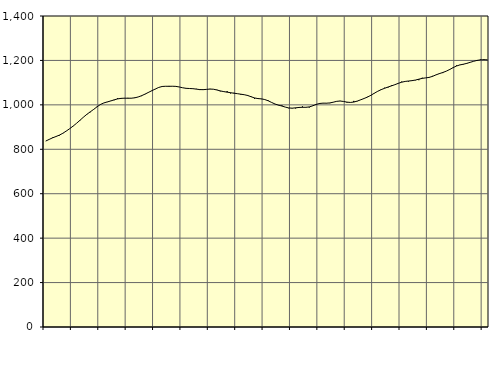
| Category | Piggar | Series 1 |
|---|---|---|
| nan | 837.2 | 837.03 |
| 87.0 | 844.1 | 844.34 |
| 87.0 | 853.3 | 851.46 |
| 87.0 | 857.9 | 857.43 |
| nan | 861.9 | 863.77 |
| 88.0 | 873.3 | 872.06 |
| 88.0 | 882.4 | 882.04 |
| 88.0 | 892.5 | 892.75 |
| nan | 903.9 | 904.34 |
| 89.0 | 916.7 | 916.91 |
| 89.0 | 929.1 | 930.48 |
| 89.0 | 943.9 | 944.34 |
| nan | 958.7 | 957.12 |
| 90.0 | 966.6 | 968.43 |
| 90.0 | 978.6 | 979.47 |
| 90.0 | 990.4 | 991.28 |
| nan | 1003.1 | 1001.68 |
| 91.0 | 1008.8 | 1008.76 |
| 91.0 | 1012.4 | 1013.27 |
| 91.0 | 1018.2 | 1017.52 |
| nan | 1020.9 | 1022.63 |
| 92.0 | 1030 | 1026.81 |
| 92.0 | 1027.6 | 1029.25 |
| 92.0 | 1031 | 1030.01 |
| nan | 1031.4 | 1029.8 |
| 93.0 | 1029.3 | 1030 |
| 93.0 | 1033.1 | 1031.62 |
| 93.0 | 1035.6 | 1035.51 |
| nan | 1039.4 | 1041.19 |
| 94.0 | 1047.6 | 1048.31 |
| 94.0 | 1057.3 | 1056.01 |
| 94.0 | 1062.6 | 1063.61 |
| nan | 1070.5 | 1071.22 |
| 95.0 | 1079.1 | 1078.28 |
| 95.0 | 1083.2 | 1082.67 |
| 95.0 | 1083.2 | 1083.63 |
| nan | 1085.1 | 1083.55 |
| 96.0 | 1083.4 | 1083.77 |
| 96.0 | 1084.2 | 1083.2 |
| 96.0 | 1080.7 | 1080.52 |
| nan | 1077.1 | 1076.98 |
| 97.0 | 1075.1 | 1074.45 |
| 97.0 | 1074.1 | 1073.63 |
| 97.0 | 1072.4 | 1072.83 |
| nan | 1072.2 | 1070.81 |
| 98.0 | 1066.6 | 1068.82 |
| 98.0 | 1070.2 | 1068.4 |
| 98.0 | 1070.2 | 1069.72 |
| nan | 1072 | 1071.07 |
| 99.0 | 1070 | 1070.34 |
| 99.0 | 1068.2 | 1067 |
| 99.0 | 1060.9 | 1062.84 |
| nan | 1058.3 | 1059.69 |
| 0.0 | 1061.8 | 1057.15 |
| 0.0 | 1051.2 | 1054.71 |
| 0.0 | 1054.1 | 1052.46 |
| nan | 1049.9 | 1050.35 |
| 1.0 | 1045.6 | 1048.03 |
| 1.0 | 1045.3 | 1045.64 |
| 1.0 | 1044.4 | 1042.15 |
| nan | 1038.1 | 1036.54 |
| 2.0 | 1027.2 | 1031.09 |
| 2.0 | 1030.1 | 1028.3 |
| 2.0 | 1025.9 | 1026.94 |
| nan | 1024.1 | 1023.96 |
| 3.0 | 1020.2 | 1018.31 |
| 3.0 | 1011.2 | 1010.81 |
| 3.0 | 1003.2 | 1003.78 |
| nan | 997.9 | 998.77 |
| 4.0 | 997.8 | 994.65 |
| 4.0 | 989.7 | 989.89 |
| 4.0 | 984.7 | 986.09 |
| nan | 984 | 985.1 |
| 5.0 | 983.9 | 986.59 |
| 5.0 | 986.8 | 988.45 |
| 5.0 | 993.2 | 988.95 |
| nan | 988 | 989.01 |
| 6.0 | 987.9 | 990.74 |
| 6.0 | 996.7 | 995.61 |
| 6.0 | 999.8 | 1001.92 |
| nan | 1008.3 | 1006.23 |
| 7.0 | 1007.3 | 1007.67 |
| 7.0 | 1006.7 | 1007.57 |
| 7.0 | 1007.7 | 1008.62 |
| nan | 1012.4 | 1011.95 |
| 8.0 | 1016.4 | 1015.82 |
| 8.0 | 1017.9 | 1017.26 |
| 8.0 | 1015 | 1015.27 |
| nan | 1010.2 | 1012.26 |
| 9.0 | 1011.4 | 1010.84 |
| 9.0 | 1017.8 | 1012.62 |
| 9.0 | 1016 | 1016.93 |
| nan | 1023.2 | 1022.62 |
| 10.0 | 1028.8 | 1028.62 |
| 10.0 | 1036.2 | 1035.05 |
| 10.0 | 1041.8 | 1043.05 |
| nan | 1053.3 | 1052.3 |
| 11.0 | 1060.8 | 1061.14 |
| 11.0 | 1066.8 | 1068.51 |
| 11.0 | 1077.2 | 1074.57 |
| nan | 1078 | 1080.22 |
| 12.0 | 1087.9 | 1085.42 |
| 12.0 | 1091.1 | 1090.8 |
| 12.0 | 1095.9 | 1096.85 |
| nan | 1104.8 | 1102.01 |
| 13.0 | 1105.4 | 1105.42 |
| 13.0 | 1105 | 1107.33 |
| 13.0 | 1108.5 | 1109.01 |
| nan | 1110.5 | 1111.63 |
| 14.0 | 1111 | 1115.51 |
| 14.0 | 1122 | 1119.23 |
| 14.0 | 1121.6 | 1121.43 |
| nan | 1122.1 | 1123.63 |
| 15.0 | 1130.4 | 1128.27 |
| 15.0 | 1135.2 | 1134.91 |
| 15.0 | 1142.5 | 1140.59 |
| nan | 1143 | 1145.71 |
| 16.0 | 1151.5 | 1151.52 |
| 16.0 | 1160.8 | 1159.03 |
| 16.0 | 1166.4 | 1167.44 |
| nan | 1177.5 | 1174.8 |
| 17.0 | 1180.4 | 1179.73 |
| 17.0 | 1181.4 | 1182.87 |
| 17.0 | 1184.9 | 1186.72 |
| nan | 1191 | 1191.42 |
| 18.0 | 1196.4 | 1196.07 |
| 18.0 | 1197.9 | 1200.05 |
| 18.0 | 1204.4 | 1202.54 |
| nan | 1205.8 | 1203.16 |
| 19.0 | 1200.6 | 1202.64 |